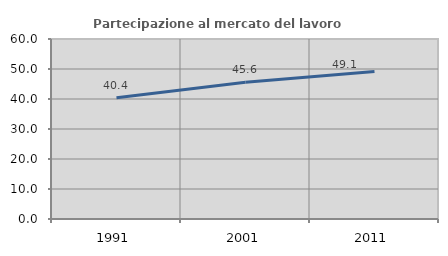
| Category | Partecipazione al mercato del lavoro  femminile |
|---|---|
| 1991.0 | 40.403 |
| 2001.0 | 45.566 |
| 2011.0 | 49.148 |